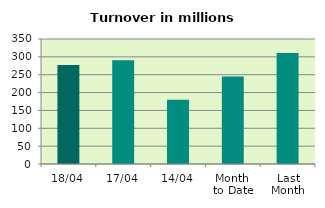
| Category | Series 0 |
|---|---|
| 18/04 | 277.009 |
| 17/04 | 290.782 |
| 14/04 | 179.8 |
| Month 
to Date | 244.847 |
| Last
Month | 310.688 |